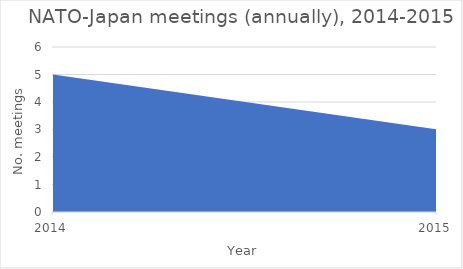
| Category | Number of meetings |
|---|---|
| 2014.0 | 5 |
| 2015.0 | 3 |